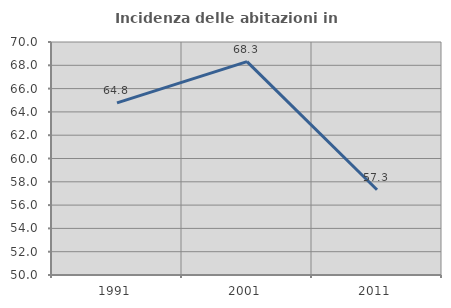
| Category | Incidenza delle abitazioni in proprietà  |
|---|---|
| 1991.0 | 64.773 |
| 2001.0 | 68.321 |
| 2011.0 | 57.321 |